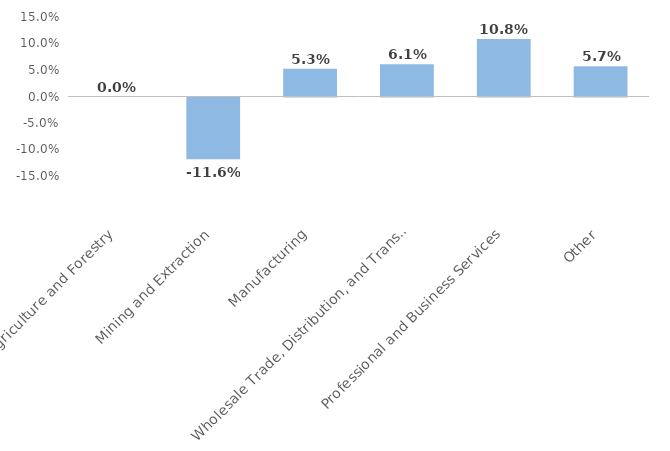
| Category | Series 0 |
|---|---|
| Agriculture and Forestry | 0 |
| Mining and Extraction | -0.116 |
| Manufacturing | 0.053 |
| Wholesale Trade, Distribution, and Transport | 0.061 |
| Professional and Business Services | 0.108 |
| Other | 0.057 |